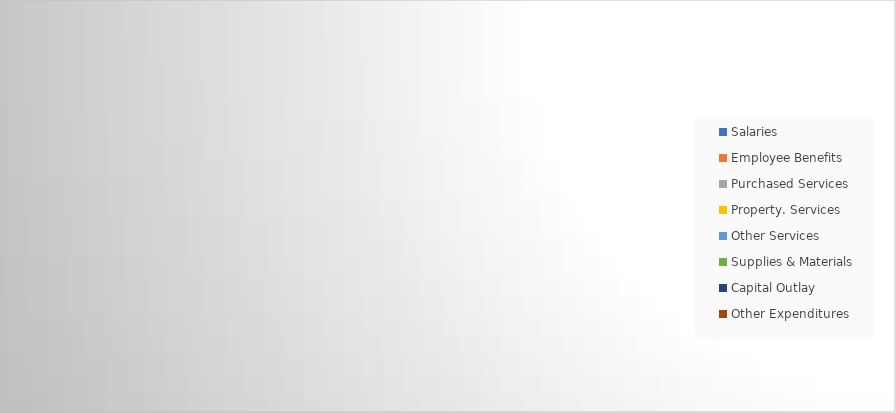
| Category | Series 0 |
|---|---|
| Salaries | 0 |
| Employee Benefits | 0 |
| Purchased Services | 0 |
| Property. Services | 0 |
| Other Services | 0 |
| Supplies & Materials | 0 |
| Capital Outlay | 0 |
| Other Expenditures | 0 |